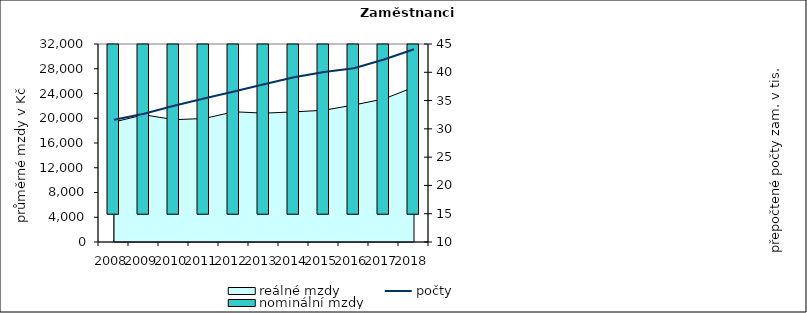
| Category | nominální mzdy  |
|---|---|
| 2008.0 | 17588.857 |
| 2009.0 | 18856.605 |
| 2010.0 | 18386.08 |
| 2011.0 | 18918.549 |
| 2012.0 | 20603.759 |
| 2013.0 | 20678.761 |
| 2014.0 | 20966.004 |
| 2015.0 | 21297.714 |
| 2016.0 | 22300.279 |
| 2017.0 | 23843.36 |
| 2018.0 | 26359.8 |